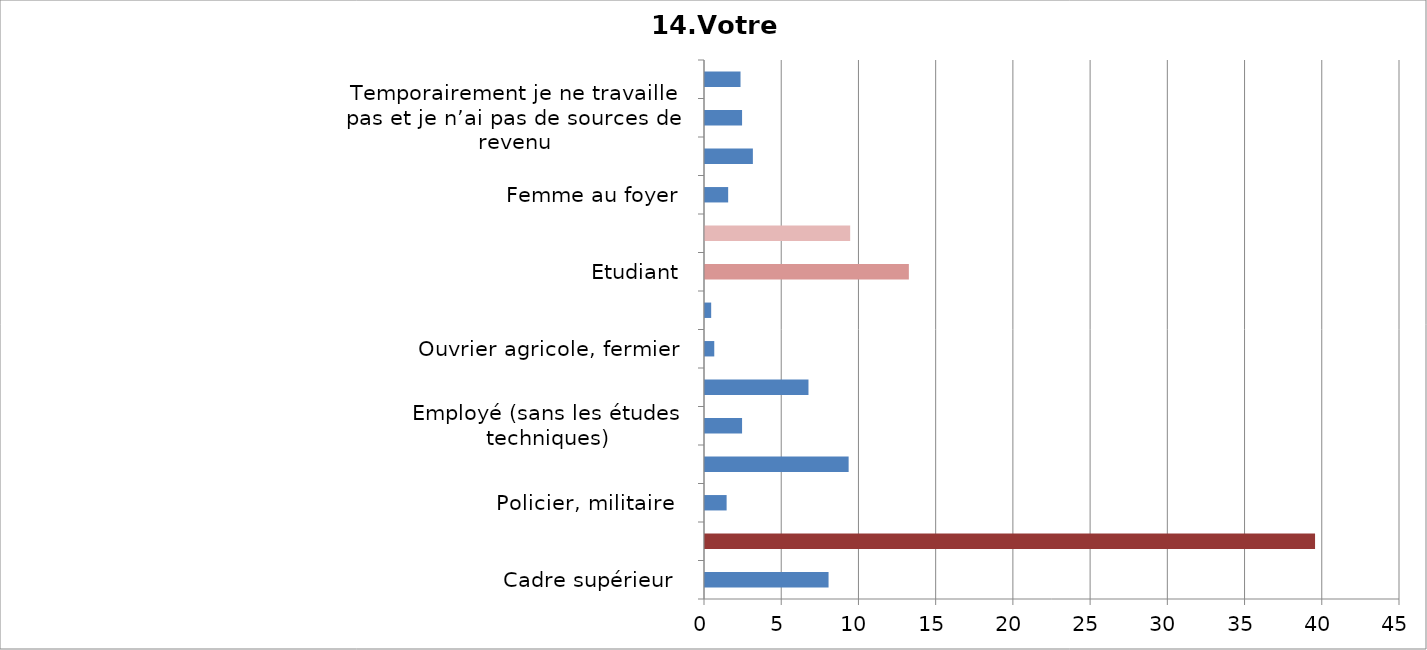
| Category | Series 0 |
|---|---|
| Cadre supérieur  | 8 |
| Cadre (titulaire d’un Bac + 5 ou BTS) | 39.5 |
| Policier, militaire  | 1.4 |
| Entrepreneur | 9.3 |
| Employé (sans les études techniques) | 2.4 |
| Salarié | 6.7 |
| Ouvrier agricole, fermier | 0.6 |
| Elève d’école | 0.4 |
| Etudiant | 13.2 |
| Retraité | 9.4 |
| Femme au foyer | 1.5 |
| Je n’ai pas de travail stable, je travaille de temps en temps selon les possibilités | 3.1 |
| Temporairement je ne travaille pas et je n’ai pas de sources de revenu | 2.4 |
| Autre | 2.3 |